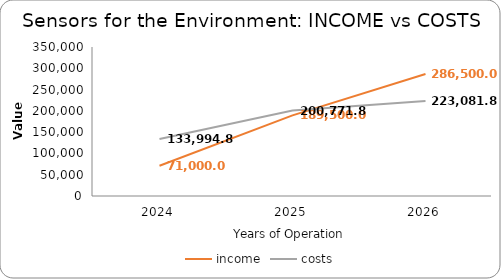
| Category | income | costs |
|---|---|---|
| 2024.0 | 71000 | 133994.8 |
| 2025.0 | 189500 | 200771.8 |
| 2026.0 | 286500 | 223081.8 |